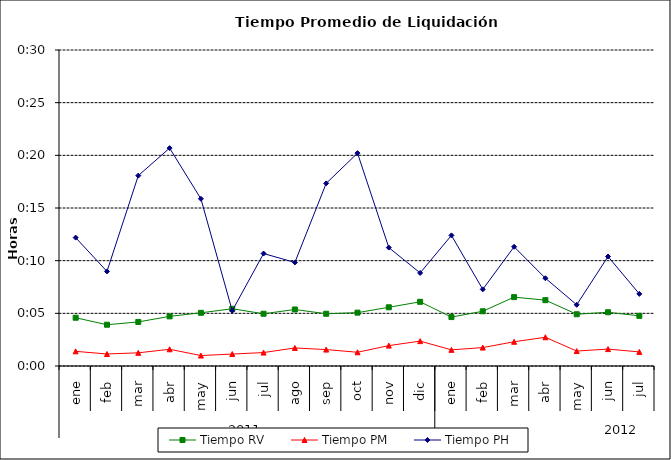
| Category | Tiempo RV | Tiempo PM | Tiempo PH |
|---|---|---|---|
| 0 | 0.003 | 0.001 | 0.009 |
| 1 | 0.003 | 0.001 | 0.006 |
| 2 | 0.003 | 0.001 | 0.013 |
| 3 | 0.003 | 0.001 | 0.014 |
| 4 | 0.004 | 0.001 | 0.011 |
| 5 | 0.004 | 0.001 | 0.004 |
| 6 | 0.003 | 0.001 | 0.007 |
| 7 | 0.004 | 0.001 | 0.007 |
| 8 | 0.003 | 0.001 | 0.012 |
| 9 | 0.004 | 0.001 | 0.014 |
| 10 | 0.004 | 0.001 | 0.008 |
| 11 | 0.004 | 0.002 | 0.006 |
| 12 | 0.003 | 0.001 | 0.009 |
| 13 | 0.004 | 0.001 | 0.005 |
| 14 | 0.005 | 0.002 | 0.008 |
| 15 | 0.004 | 0.002 | 0.006 |
| 16 | 0.003 | 0.001 | 0.004 |
| 17 | 0.004 | 0.001 | 0.007 |
| 18 | 0.003 | 0.001 | 0.005 |